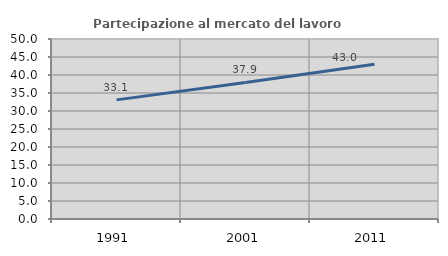
| Category | Partecipazione al mercato del lavoro  femminile |
|---|---|
| 1991.0 | 33.087 |
| 2001.0 | 37.922 |
| 2011.0 | 42.966 |